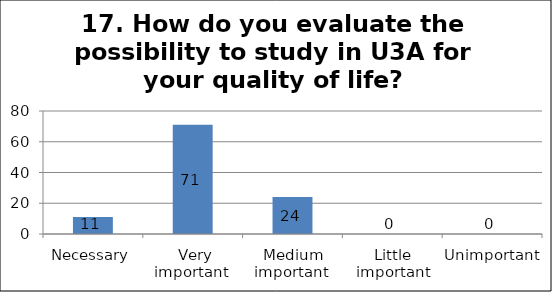
| Category | Series 0 |
|---|---|
| Necessary | 11 |
|  Very important  | 71 |
| Medium important  | 24 |
| Little important | 0 |
| Unimportant  | 0 |